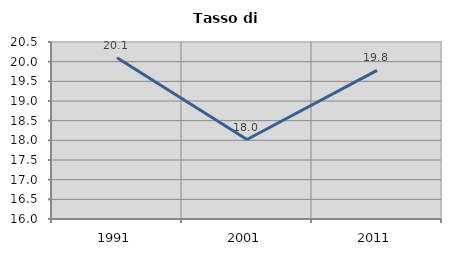
| Category | Tasso di disoccupazione   |
|---|---|
| 1991.0 | 20.099 |
| 2001.0 | 18.021 |
| 2011.0 | 19.777 |